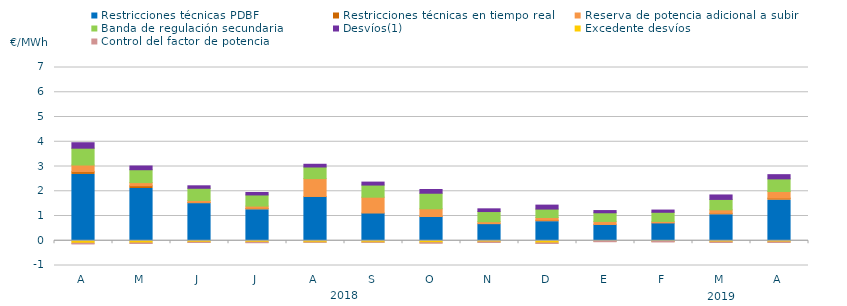
| Category | Restricciones técnicas PDBF | Restricciones técnicas en tiempo real | Reserva de potencia adicional a subir | Banda de regulación secundaria | Desvíos(1) | Excedente desvíos | Control del factor de potencia |
|---|---|---|---|---|---|---|---|
| A | 2.68 | 0.11 | 0.27 | 0.68 | 0.22 | -0.1 | -0.07 |
| M | 2.11 | 0.11 | 0.13 | 0.52 | 0.15 | -0.09 | -0.06 |
| J | 1.5 | 0.05 | 0.08 | 0.49 | 0.1 | -0.06 | -0.05 |
| J | 1.25 | 0.06 | 0.09 | 0.45 | 0.1 | -0.06 | -0.06 |
| A | 1.75 | 0.04 | 0.72 | 0.47 | 0.11 | -0.06 | -0.04 |
| S | 1.1 | 0.02 | 0.64 | 0.49 | 0.12 | -0.06 | -0.04 |
| O | 0.94 | 0.04 | 0.31 | 0.63 | 0.15 | -0.08 | -0.06 |
| N | 0.67 | 0.02 | 0.08 | 0.41 | 0.11 | -0.05 | -0.06 |
| D | 0.77 | 0.06 | 0.11 | 0.34 | 0.16 | -0.09 | -0.06 |
| E | 0.63 | 0.03 | 0.12 | 0.35 | 0.09 | -0.01 | -0.07 |
| F | 0.71 | 0.01 | 0.06 | 0.37 | 0.09 | -0.03 | -0.06 |
| M | 1.05 | 0.06 | 0.14 | 0.42 | 0.18 | -0.05 | -0.06 |
| A | 1.64 | 0.08 | 0.27 | 0.51 | 0.17 | -0.05 | -0.06 |